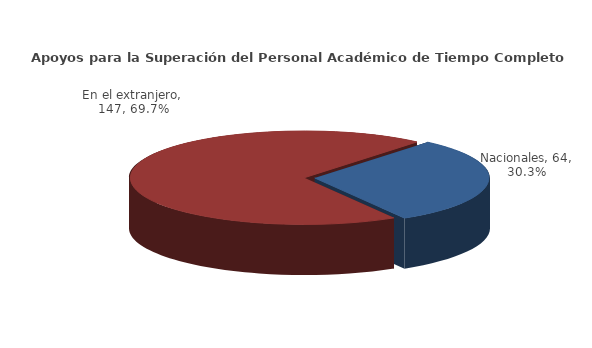
| Category | Series 0 |
|---|---|
| Nacionales | 64 |
| En el extranjero | 147 |